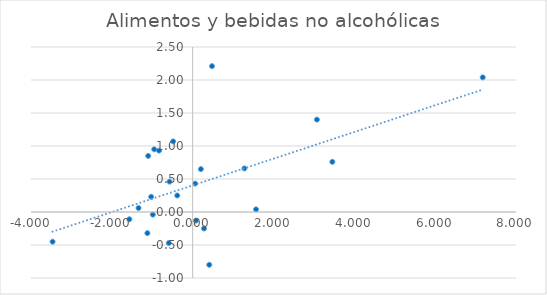
| Category | Alimentos y bebidas no alcohólicas |
|---|---|
| 0.06052582200249956 | 0.43 |
| -1.339539147515001 | 0.06 |
| -1.1203229332582998 | -0.32 |
| -0.9862037445886013 | -0.04 |
| -3.4662710747771994 | -0.45 |
| 0.4103518494638997 | -0.8 |
| -1.5653149541481977 | -0.11 |
| 1.5673496706761991 | 0.04 |
| 7.1770364527009995 | 2.04 |
| 0.47884246635880034 | 2.21 |
| -0.832734952533401 | 0.93 |
| 3.4562493478376117 | 0.76 |
| 0.28079979651694786 | -0.25 |
| -0.5906758229193689 | -0.47 |
| -0.38208630553888956 | 0.25 |
| -0.5726169698249004 | 0.46 |
| 0.08025158798270066 | -0.13 |
| 1.2789830493301095 | 0.66 |
| -1.1005497828799102 | 0.85 |
| 0.20330044603610042 | 0.65 |
| -0.48222478231940147 | 1.07 |
| -0.9518304220709997 | 0.95 |
| -1.027059621055 | 0.23 |
| 3.074367518631871 | 1.4 |